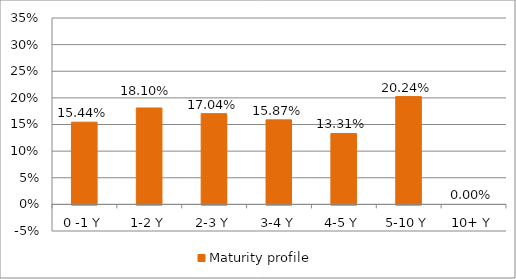
| Category | Maturity profile |
|---|---|
| 0 -1 Y | 0.154 |
| 1-2 Y | 0.181 |
| 2-3 Y | 0.17 |
| 3-4 Y | 0.159 |
| 4-5 Y | 0.133 |
| 5-10 Y | 0.202 |
| 10+ Y | 0 |